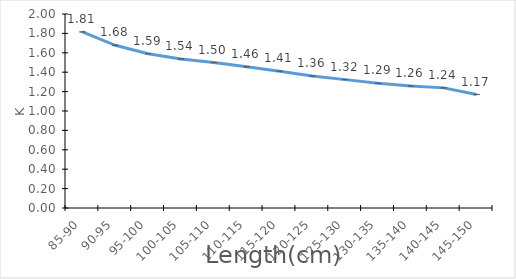
| Category | Series 0 |
|---|---|
| 85-90 | 1.815 |
| 90-95 | 1.677 |
| 95-100 | 1.591 |
| 100-105 | 1.535 |
| 105-110 | 1.499 |
| 110-115 | 1.455 |
| 115-120 | 1.41 |
| 120-125 | 1.36 |
| 125-130 | 1.323 |
| 130-135 | 1.285 |
| 135-140 | 1.258 |
| 140-145 | 1.238 |
| 145-150 | 1.17 |